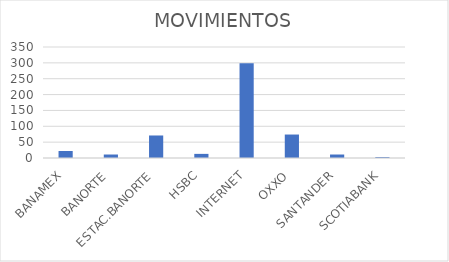
| Category | MOVIMIENTOS |
|---|---|
| BANAMEX | 22 |
| BANORTE | 11 |
| ESTAC.BANORTE | 71 |
| HSBC | 13 |
| INTERNET | 299 |
| OXXO | 74 |
| SANTANDER | 11 |
| SCOTIABANK | 3 |